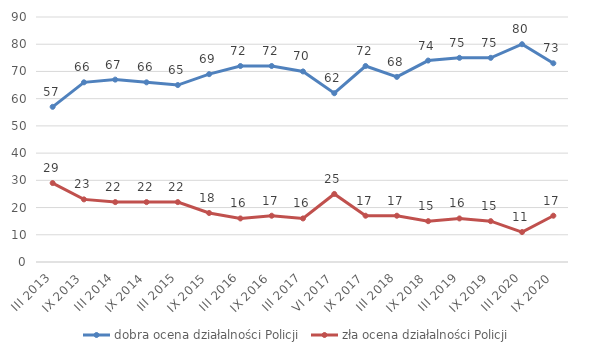
| Category | dobra ocena działalności Policji | zła ocena działalności Policji |
|---|---|---|
| III 2013 | 57 | 29 |
| IX 2013 | 66 | 23 |
| III 2014 | 67 | 22 |
| IX 2014 | 66 | 22 |
| III 2015 | 65 | 22 |
| IX 2015 | 69 | 18 |
| III 2016 | 72 | 16 |
| IX 2016 | 72 | 17 |
| III 2017 | 70 | 16 |
| VI 2017 | 62 | 25 |
| IX 2017 | 72 | 17 |
| III 2018 | 68 | 17 |
| IX 2018 | 74 | 15 |
| III 2019 | 75 | 16 |
| IX 2019 | 75 | 15 |
| III 2020 | 80 | 11 |
| IX 2020 | 73 | 17 |